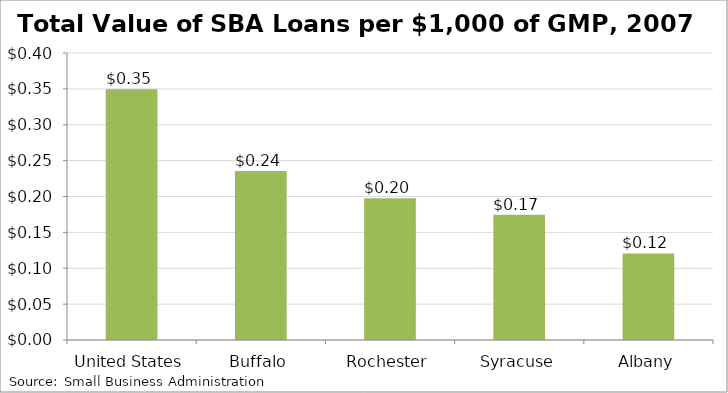
| Category | Total Value of SBA Loans per $1,000 of GMP |
|---|---|
| United States | 0.349 |
| Buffalo | 0.236 |
| Rochester | 0.198 |
| Syracuse | 0.175 |
| Albany | 0.121 |